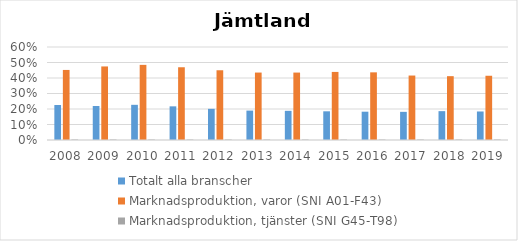
| Category | Totalt alla branscher | Marknadsproduktion, varor (SNI A01-F43) | Marknadsproduktion, tjänster (SNI G45-T98) |
|---|---|---|---|
| 2008 | 0.226 | 0.452 | 0.003 |
| 2009 | 0.219 | 0.475 | 0.003 |
| 2010 | 0.227 | 0.485 | 0.003 |
| 2011 | 0.217 | 0.469 | 0.003 |
| 2012 | 0.201 | 0.45 | 0.003 |
| 2013 | 0.19 | 0.435 | 0.003 |
| 2014 | 0.188 | 0.435 | 0.003 |
| 2015 | 0.185 | 0.439 | 0.003 |
| 2016 | 0.183 | 0.436 | 0.003 |
| 2017 | 0.182 | 0.416 | 0.003 |
| 2018 | 0.186 | 0.412 | 0.003 |
| 2019 | 0.184 | 0.414 | 0.003 |